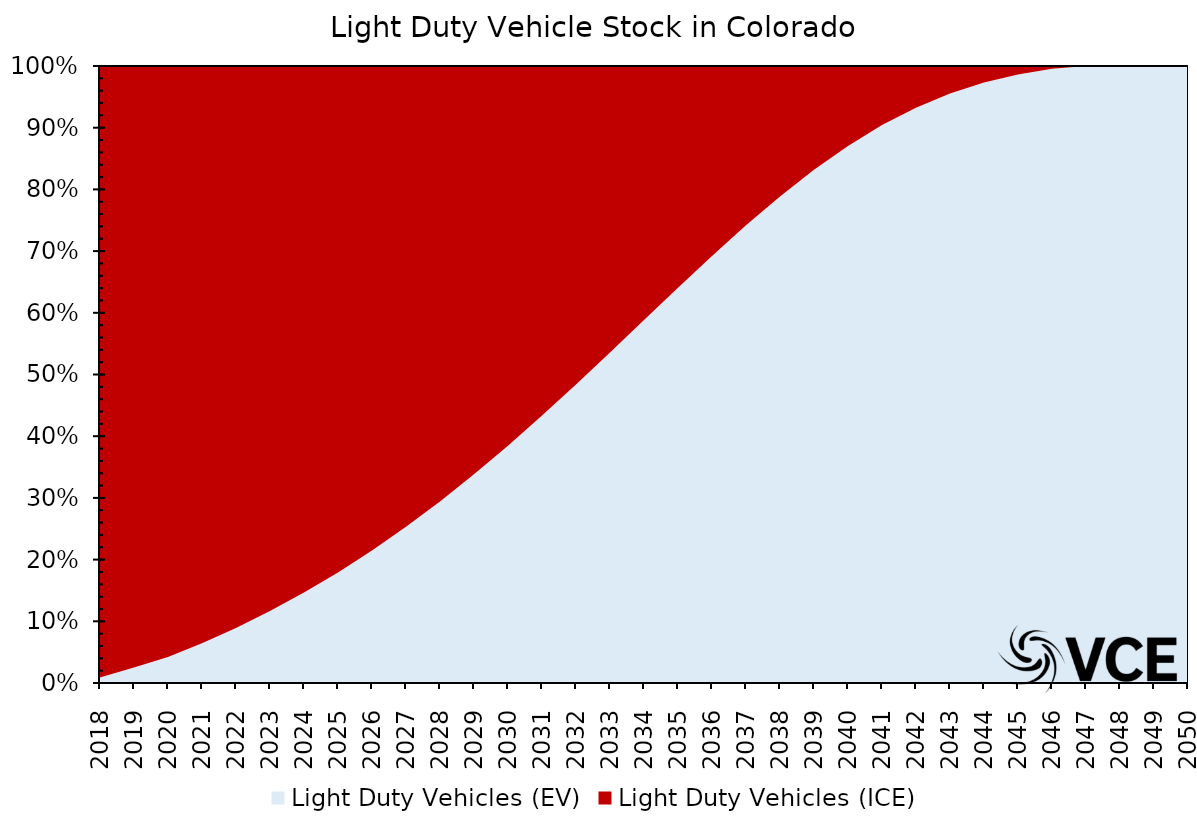
| Category | Light Duty Vehicles (EV) | Light Duty Vehicles (ICE) |
|---|---|---|
| 2018.0 | 0.009 | 0.997 |
| 2019.0 | 0.025 | 0.978 |
| 2020.0 | 0.042 | 0.958 |
| 2021.0 | 0.064 | 0.936 |
| 2022.0 | 0.089 | 0.911 |
| 2023.0 | 0.117 | 0.883 |
| 2024.0 | 0.147 | 0.853 |
| 2025.0 | 0.179 | 0.821 |
| 2026.0 | 0.215 | 0.785 |
| 2027.0 | 0.253 | 0.747 |
| 2028.0 | 0.294 | 0.706 |
| 2029.0 | 0.338 | 0.662 |
| 2030.0 | 0.385 | 0.615 |
| 2031.0 | 0.433 | 0.567 |
| 2032.0 | 0.484 | 0.516 |
| 2033.0 | 0.536 | 0.464 |
| 2034.0 | 0.588 | 0.412 |
| 2035.0 | 0.641 | 0.359 |
| 2036.0 | 0.692 | 0.308 |
| 2037.0 | 0.742 | 0.258 |
| 2038.0 | 0.789 | 0.211 |
| 2039.0 | 0.832 | 0.168 |
| 2040.0 | 0.871 | 0.129 |
| 2041.0 | 0.904 | 0.096 |
| 2042.0 | 0.933 | 0.067 |
| 2043.0 | 0.955 | 0.045 |
| 2044.0 | 0.973 | 0.027 |
| 2045.0 | 0.986 | 0.014 |
| 2046.0 | 0.995 | 0.005 |
| 2047.0 | 1 | 0 |
| 2048.0 | 1 | 0 |
| 2049.0 | 1 | 0 |
| 2050.0 | 1 | 0 |